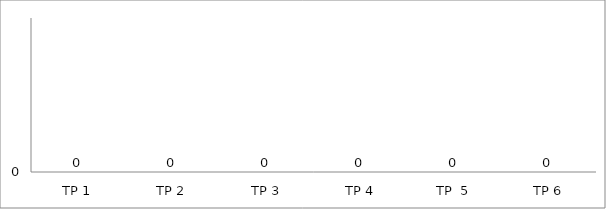
| Category | BIL. MURID |
|---|---|
| TP 1 | 0 |
| TP 2 | 0 |
|  TP 3 | 0 |
| TP 4 | 0 |
| TP  5 | 0 |
| TP 6 | 0 |